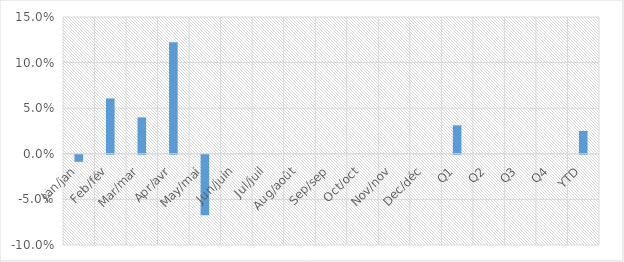
| Category | Total YoY % Change |
|---|---|
| Jan/jan | -0.008 |
| Feb/fév | 0.061 |
| Mar/mar | 0.04 |
| Apr/avr | 0.122 |
| May/mai | -0.066 |
| Jun/juin | 0 |
| Jul/juil | 0 |
| Aug/août | 0 |
| Sep/sep | 0 |
| Oct/oct | 0 |
| Nov/nov | 0 |
| Dec/déc | 0 |
| Q1 | 0.031 |
| Q2 | 0 |
| Q3 | 0 |
| Q4 | 0 |
| YTD | 0.025 |